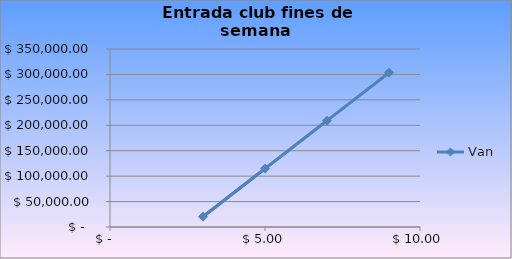
| Category | Van |
|---|---|
| 5.0 | 114699.073 |
| 3.0 | 20353.454 |
| 7.0 | 209044.692 |
| 9.0 | 303390.31 |